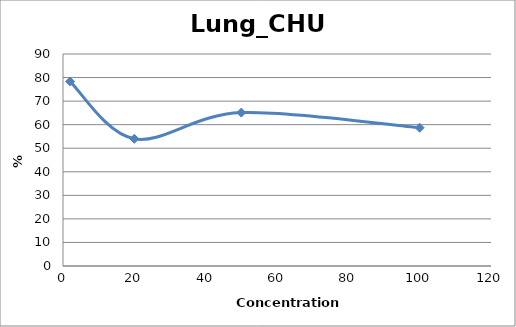
| Category | Lung_CHU2 |
|---|---|
| 100.0 | 58.697 |
| 50.0 | 65.113 |
| 20.0 | 53.995 |
| 2.0 | 78.322 |
| nan | 0 |
| nan | 0 |
| nan | 0 |
| nan | 0 |
| nan | 0 |